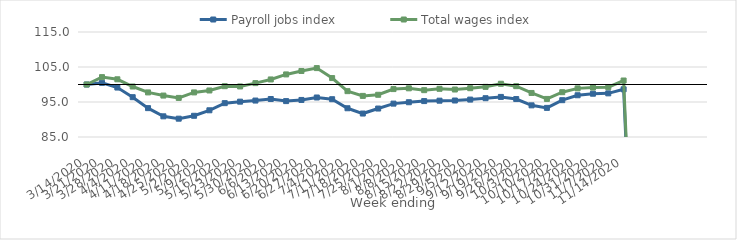
| Category | Payroll jobs index | Total wages index |
|---|---|---|
| 14/03/2020 | 100 | 100 |
| 21/03/2020 | 100.46 | 102.105 |
| 28/03/2020 | 99.129 | 101.487 |
| 04/04/2020 | 96.376 | 99.424 |
| 11/04/2020 | 93.247 | 97.738 |
| 18/04/2020 | 90.91 | 96.839 |
| 25/04/2020 | 90.236 | 96.167 |
| 02/05/2020 | 91.062 | 97.739 |
| 09/05/2020 | 92.632 | 98.294 |
| 16/05/2020 | 94.674 | 99.519 |
| 23/05/2020 | 95.098 | 99.442 |
| 30/05/2020 | 95.413 | 100.393 |
| 06/06/2020 | 95.849 | 101.444 |
| 13/06/2020 | 95.258 | 102.88 |
| 20/06/2020 | 95.588 | 103.869 |
| 27/06/2020 | 96.288 | 104.685 |
| 04/07/2020 | 95.796 | 101.838 |
| 11/07/2020 | 93.211 | 98.1 |
| 18/07/2020 | 91.702 | 96.745 |
| 25/07/2020 | 93.132 | 97.063 |
| 01/08/2020 | 94.537 | 98.688 |
| 08/08/2020 | 94.932 | 98.908 |
| 15/08/2020 | 95.263 | 98.381 |
| 22/08/2020 | 95.377 | 98.771 |
| 29/08/2020 | 95.427 | 98.566 |
| 05/09/2020 | 95.688 | 98.945 |
| 12/09/2020 | 96.087 | 99.33 |
| 19/09/2020 | 96.452 | 100.213 |
| 26/09/2020 | 95.843 | 99.523 |
| 03/10/2020 | 94.044 | 97.584 |
| 10/10/2020 | 93.321 | 95.879 |
| 17/10/2020 | 95.521 | 97.8 |
| 24/10/2020 | 96.926 | 98.893 |
| 31/10/2020 | 97.368 | 99.131 |
| 07/11/2020 | 97.472 | 99.238 |
| 14/11/2020 | 98.629 | 101.139 |